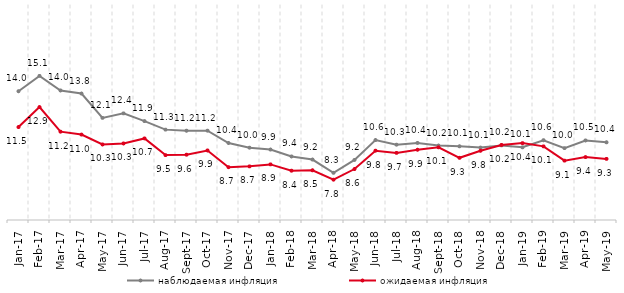
| Category | наблюдаемая инфляция | ожидаемая инфляция |
|---|---|---|
| 2017-01-01 | 13.983 | 11.486 |
| 2017-02-01 | 15.056 | 12.879 |
| 2017-03-01 | 14.037 | 11.162 |
| 2017-04-01 | 13.824 | 10.959 |
| 2017-05-01 | 12.123 | 10.27 |
| 2017-06-01 | 12.44 | 10.34 |
| 2017-07-01 | 11.9 | 10.692 |
| 2017-08-01 | 11.305 | 9.527 |
| 2017-09-01 | 11.229 | 9.556 |
| 2017-10-01 | 11.232 | 9.85 |
| 2017-11-01 | 10.372 | 8.687 |
| 2017-12-01 | 10.047 | 8.742 |
| 2018-01-01 | 9.916 | 8.879 |
| 2018-02-01 | 9.433 | 8.44 |
| 2018-03-01 | 9.218 | 8.469 |
| 2018-04-01 | 8.292 | 7.814 |
| 2018-05-01 | 9.192 | 8.556 |
| 2018-06-01 | 10.578 | 9.837 |
| 2018-07-01 | 10.255 | 9.682 |
| 2018-08-01 | 10.378 | 9.901 |
| 2018-09-01 | 10.196 | 10.07 |
| 2018-10-01 | 10.143 | 9.339 |
| 2018-11-01 | 10.053 | 9.831 |
| 2018-12-01 | 10.205 | 10.236 |
| 2019-01-01 | 10.071 | 10.363 |
| 2019-02-01 | 10.567 | 10.136 |
| 2019-03-01 | 10.013 | 9.141 |
| 2019-04-01 | 10.548 | 9.39 |
| 2019-05-01 | 10.421 | 9.264 |